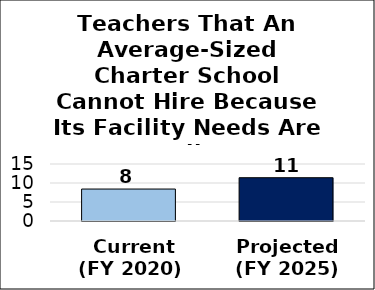
| Category | Teachers that an average-sized charter school cannot hire because its facility are not needs fully met |
|---|---|
|  Current
(FY 2020) | 8.412 |
| Projected
(FY 2025) | 11.393 |